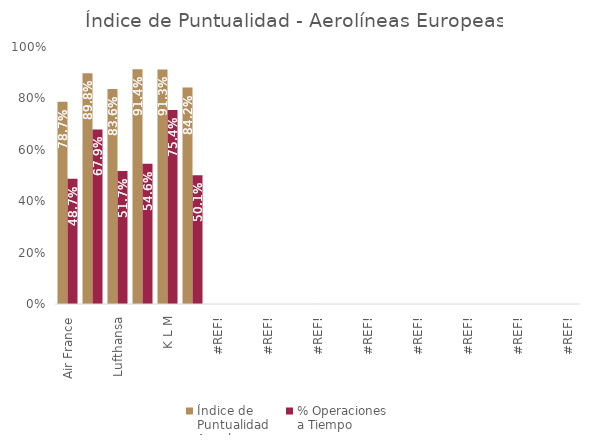
| Category | Índice de 
Puntualidad
Anual | % Operaciones 
a Tiempo |
|---|---|---|
| Air France | 0.787 | 0.487 |
| British Airways | 0.898 | 0.679 |
| Lufthansa | 0.836 | 0.517 |
| Iberia | 0.914 | 0.546 |
| K L M | 0.913 | 0.754 |
| Turkish Airlines | 0.842 | 0.501 |
| #¡REF! | 0 | 0 |
| #¡REF! | 0 | 0 |
| #¡REF! | 0 | 0 |
| #¡REF! | 0 | 0 |
| #¡REF! | 0 | 0 |
| #¡REF! | 0 | 0 |
| #¡REF! | 0 | 0 |
| #¡REF! | 0 | 0 |
| #¡REF! | 0 | 0 |
| #¡REF! | 0 | 0 |
| #¡REF! | 0 | 0 |
| #¡REF! | 0 | 0 |
| #¡REF! | 0 | 0 |
| #¡REF! | 0 | 0 |
| #¡REF! | 0 | 0 |